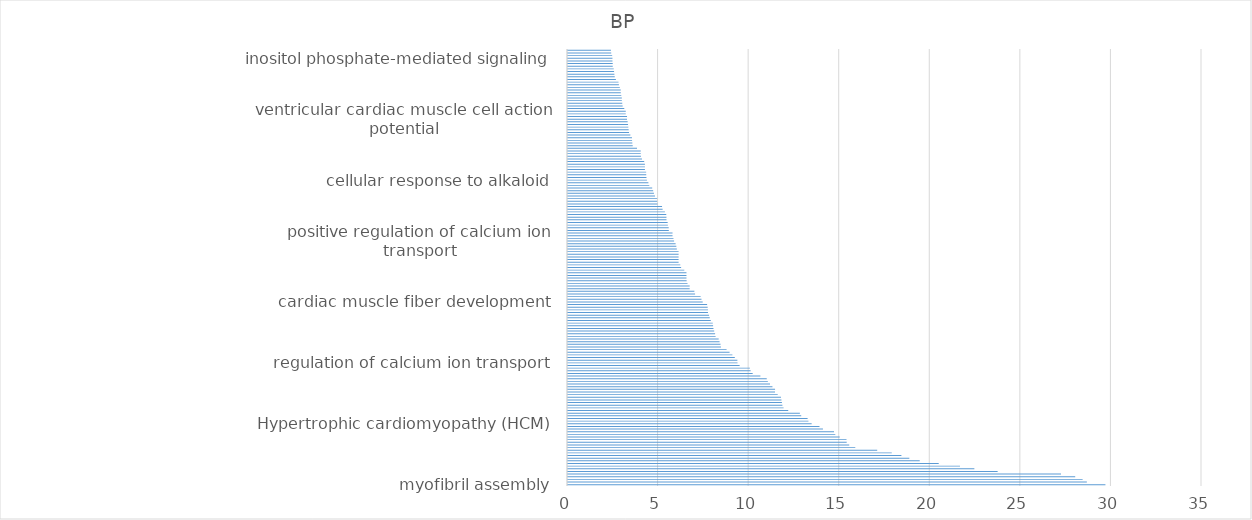
| Category | Bejamini2 |
|---|---|
| myofibril assembly | 29.669 |
| muscle cell development | 28.642 |
| cellular component assembly involved in morphogenesis | 28.41 |
| striated muscle cell development | 28 |
| muscle system process | 27.219 |
| striated muscle cell differentiation | 23.718 |
| muscle cell differentiation | 22.434 |
| actomyosin structure organization | 21.639 |
| muscle structure development | 20.466 |
| sarcomere organization | 19.416 |
| striated muscle tissue development | 18.843 |
| muscle tissue development | 18.405 |
| muscle contraction | 17.872 |
| regulation of muscle system process | 17.069 |
| striated muscle contraction | 15.86 |
| release of sequestered calcium ion into cytosol by sarcoplasmic reticulum | 15.525 |
| muscle fiber development | 15.385 |
| release of sequestered calcium ion into cytosol by endoplasmic reticulum | 15.375 |
| heart contraction | 15 |
| heart process | 14.757 |
| cardiac muscle contraction | 14.686 |
| regulation of release of sequestered calcium ion into cytosol by sarcoplasmic reticulum | 14.074 |
| cardiac muscle tissue development | 13.883 |
| Hypertrophic cardiomyopathy (HCM) | 13.45 |
| cardiac myofibril assembly | 13.273 |
| Dilated cardiomyopathy (DCM) | 13.227 |
| muscle organ development | 12.874 |
| regulation of release of sequestered calcium ion into cytosol | 12.801 |
| muscle adaptation | 12.158 |
| release of sequestered calcium ion into cytosol | 11.901 |
| negative regulation of sequestering of calcium ion | 11.837 |
| cardiac muscle cell development | 11.809 |
| regulation of sequestering of calcium ion | 11.783 |
| sequestering of calcium ion | 11.756 |
| regulation of calcium ion transport into cytosol | 11.578 |
| cardiac muscle cell differentiation | 11.43 |
| cardiac cell development | 11.43 |
| calcium ion transmembrane import into cytosol | 11.286 |
| regulation of cardiac muscle contraction by regulation of the release of sequestered calcium ion | 11.154 |
| regulation of calcium ion transmembrane transport | 11.033 |
| maintenance of location | 10.971 |
| calcium ion transport into cytosol | 10.621 |
| cardiocyte differentiation | 10.196 |
| regulation of striated muscle contraction | 10.081 |
| regulation of muscle contraction | 10.044 |
| regulation of cardiac muscle contraction by calcium ion signaling | 9.475 |
| regulation of calcium ion transport | 9.358 |
| calcium ion transmembrane transport | 9.35 |
| regulation of cation transmembrane transport | 9.209 |
| regulation of heart contraction | 9.075 |
| cardiac muscle tissue morphogenesis | 8.919 |
| ryanodine-sensitive calcium-release channel activity | 8.754 |
| calcium-release channel activity | 8.442 |
| muscle tissue morphogenesis | 8.42 |
| Arrhythmogenic right ventricular cardiomyopathy (ARVC) | 8.367 |
| skeletal muscle contraction | 8.318 |
| regulation of muscle adaptation | 8.149 |
| muscle organ morphogenesis | 8.12 |
| ligand-gated calcium channel activity | 8.07 |
| cardiac muscle hypertrophy | 8.03 |
| skeletal muscle thin filament assembly | 8.01 |
| regulation of cardiac muscle contraction | 7.991 |
| striated muscle hypertrophy | 7.883 |
| muscle hypertrophy | 7.825 |
| regulation of blood circulation | 7.787 |
| Viral myocarditis | 7.727 |
| regulation of calcium ion transmembrane transporter activity | 7.727 |
| skeletal myofibril assembly | 7.71 |
| calcium ion transmembrane transporter activity | 7.679 |
| cardiac muscle fiber development | 7.435 |
| calcium-mediated signaling | 7.369 |
| musculoskeletal movement | 7.321 |
| positive regulation of transmembrane transport | 7.015 |
| response to stimulus involved in regulation of muscle adaptation | 6.976 |
| striated muscle myosin thick filament assembly | 6.716 |
| skeletal muscle myosin thick filament assembly | 6.716 |
| response to muscle stretch | 6.598 |
| regulation of cation channel activity | 6.548 |
| cellular response to caffeine | 6.54 |
| myosin filament assembly | 6.54 |
| response to calcium ion | 6.54 |
| positive regulation of cation transmembrane transport | 6.421 |
| striated muscle adaptation | 6.244 |
| positive regulation of calcium ion transmembrane transport | 6.199 |
| positive regulation of ion transmembrane transport | 6.105 |
| myosin filament organization | 6.105 |
| response to denervation involved in regulation of muscle adaptation | 6.105 |
| response to muscle inactivity involved in regulation of muscle adaptation | 6.105 |
| response to muscle inactivity | 6.105 |
| skeletal muscle tissue development | 6.008 |
| cellular response to purine-containing compound | 5.98 |
| regulation of calcium-mediated signaling | 5.94 |
| positive regulation of calcium ion transport | 5.856 |
| skeletal muscle organ development | 5.822 |
| structural constituent of cytoskeleton | 5.77 |
| positive regulation of sequestering of calcium ion | 5.77 |
| regulation of ryanodine-sensitive calcium-release channel activity | 5.565 |
| positive regulation of ion transmembrane transporter activity | 5.559 |
| myotube cell development | 5.513 |
| detection of muscle stretch | 5.502 |
| myotube differentiation | 5.437 |
| positive regulation of calcium ion transmembrane transporter activity | 5.435 |
| positive regulation of transporter activity | 5.424 |
| skeletal muscle tissue regeneration | 5.349 |
| regulation of actin filament-based movement | 5.222 |
| Focal adhesion | 5.191 |
| actin-mediated cell contraction | 4.941 |
| response to diuretic | 4.921 |
| response to caffeine | 4.921 |
| skeletal muscle adaptation | 4.8 |
| negative regulation of calcium-mediated signaling | 4.745 |
| regulation of heart rate | 4.701 |
| cGMP-PKG signaling pathway | 4.648 |
| regulation of the force of heart contraction | 4.489 |
| actin filament-based movement | 4.439 |
| cellular response to alkaloid | 4.357 |
| regulation of skeletal muscle contraction | 4.331 |
| skeletal muscle fiber development | 4.319 |
| regulation of ATPase activity | 4.315 |
| negative regulation of release of sequestered calcium ion into cytosol | 4.246 |
| positive regulation of cation channel activity | 4.246 |
| tissue regeneration | 4.246 |
| regulation of cardiac muscle cell contraction | 4.207 |
| dendrite self-avoidance | 4.083 |
| response to alkaloid | 4.026 |
| positive regulation of striated muscle contraction | 4.016 |
| negative regulation of calcium ion transport into cytosol | 4.016 |
| adult heart development | 3.811 |
| cardiac muscle cell action potential | 3.572 |
| regulation of potassium ion transmembrane transporter activity | 3.551 |
| response to muscle activity | 3.537 |
| ventricular cardiac muscle tissue morphogenesis | 3.53 |
| Platelet activation | 3.442 |
| regulation of myoblast differentiation | 3.369 |
| cardiac muscle cell contraction | 3.349 |
| ventricular cardiac muscle tissue development | 3.331 |
| positive regulation of calcium ion transport into cytosol | 3.314 |
| regulation of cardiac muscle cell action potential | 3.293 |
| ventricular cardiac muscle cell action potential | 3.258 |
| Cardiac muscle contraction | 3.258 |
| cell-cell adhesion mediator activity | 3.189 |
| regulation of membrane repolarization | 3.189 |
| Insulin secretion | 3.107 |
| cardiac ventricle morphogenesis | 3.017 |
| negative regulation of calcium ion transmembrane transport | 2.995 |
| regulation of potassium ion transmembrane transport | 2.972 |
| cellular response to calcium ion | 2.972 |
| positive regulation of myotube differentiation | 2.941 |
| cell adhesion mediator activity | 2.914 |
| regulation of protein depolymerization | 2.911 |
| membrane repolarization | 2.862 |
| cardiac muscle cell action potential involved in contraction | 2.811 |
| positive regulation of heart contraction | 2.787 |
| positive regulation of release of sequestered calcium ion into cytosol | 2.644 |
| positive regulation of muscle contraction | 2.58 |
| regulation of actin filament depolymerization | 2.561 |
| regulation of skeletal muscle tissue development | 2.543 |
| neuron recognition | 2.524 |
| detection of mechanical stimulus | 2.469 |
| actin filament depolymerization | 2.469 |
| cardiac conduction | 2.454 |
| inositol phosphate-mediated signaling | 2.454 |
| negative regulation of calcium ion transport | 2.438 |
| regulation of myotube differentiation | 2.385 |
| regulation of action potential | 2.37 |